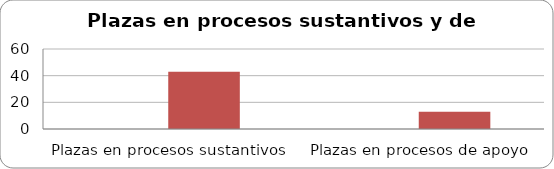
| Category | Series 0 | Series 1 |
|---|---|---|
| Plazas en procesos sustantivos | 0 | 43 |
| Plazas en procesos de apoyo | 0 | 13 |